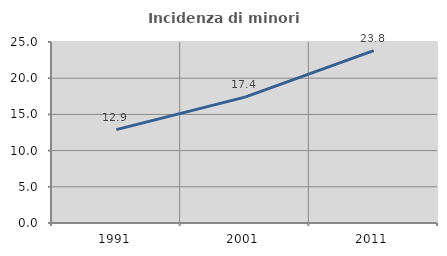
| Category | Incidenza di minori stranieri |
|---|---|
| 1991.0 | 12.903 |
| 2001.0 | 17.391 |
| 2011.0 | 23.81 |